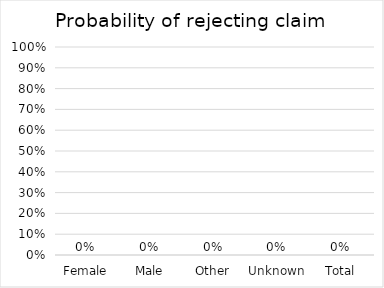
| Category |  Probability of rejecting claim  |
|---|---|
| Female | 0 |
| Male | 0 |
| Other | 0 |
| Unknown | 0 |
| Total | 0 |